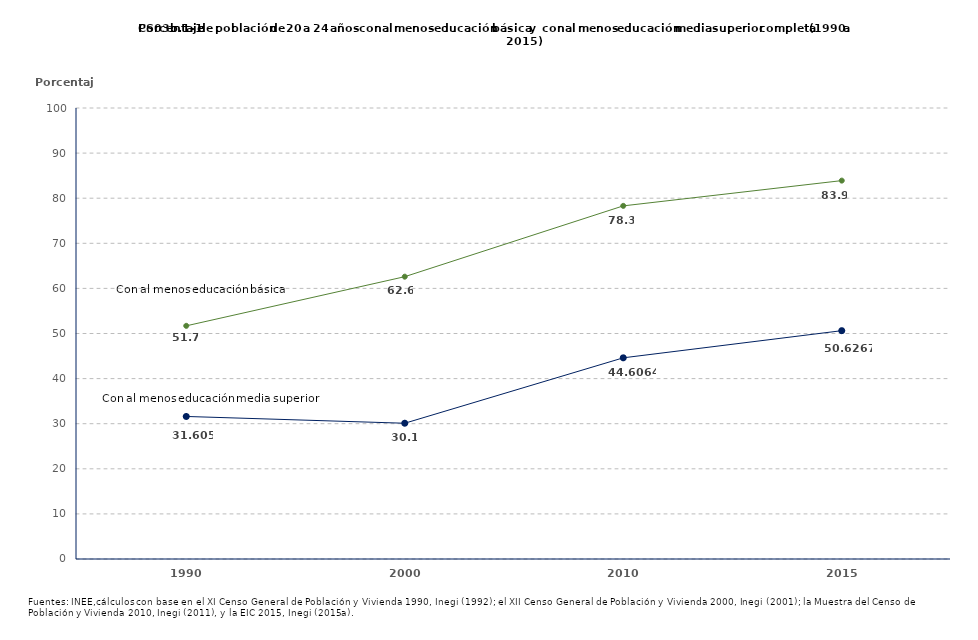
| Category | EB | Series 1 |
|---|---|---|
| 1990.0 | 31.605 | 51.7 |
| 2000.0 | 30.1 | 62.6 |
| 2010.0 | 44.606 | 78.3 |
| 2015.0 | 50.627 | 83.9 |